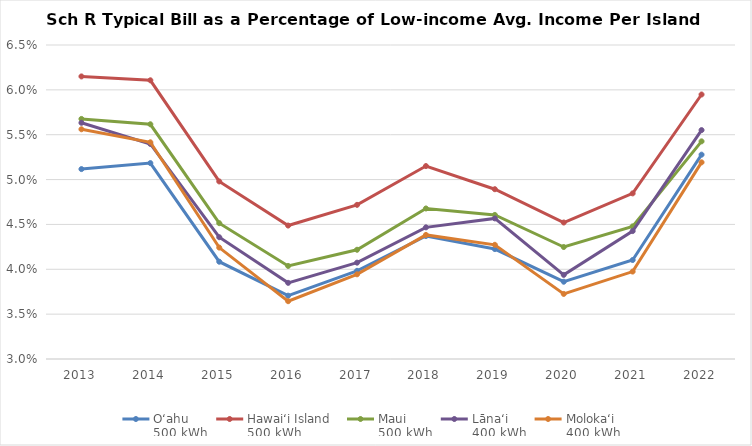
| Category | Oʻahu
500 kWh | Hawaiʻi Island
500 kWh | Maui
500 kWh | Lānaʻi
400 kWh | Molokaʻi
400 kWh |
|---|---|---|---|---|---|
| 2013.0 | 0.051 | 0.061 | 0.057 | 0.056 | 0.056 |
| 2014.0 | 0.052 | 0.061 | 0.056 | 0.054 | 0.054 |
| 2015.0 | 0.041 | 0.05 | 0.045 | 0.044 | 0.042 |
| 2016.0 | 0.037 | 0.045 | 0.04 | 0.038 | 0.036 |
| 2017.0 | 0.04 | 0.047 | 0.042 | 0.041 | 0.039 |
| 2018.0 | 0.044 | 0.052 | 0.047 | 0.045 | 0.044 |
| 2019.0 | 0.042 | 0.049 | 0.046 | 0.046 | 0.043 |
| 2020.0 | 0.039 | 0.045 | 0.042 | 0.039 | 0.037 |
| 2021.0 | 0.041 | 0.048 | 0.045 | 0.044 | 0.04 |
| 2022.0 | 0.053 | 0.059 | 0.054 | 0.056 | 0.052 |